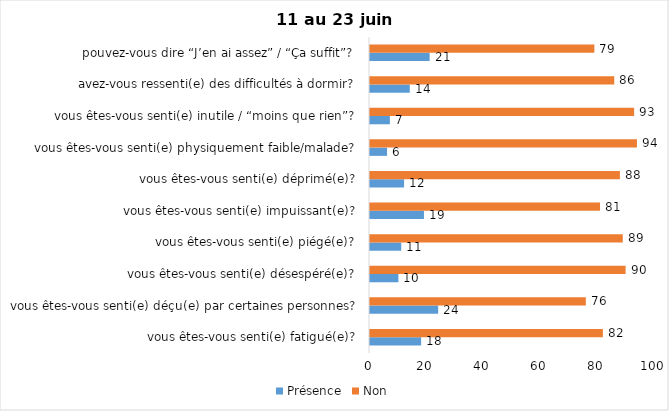
| Category | Présence | Non |
|---|---|---|
| vous êtes-vous senti(e) fatigué(e)? | 18 | 82 |
| vous êtes-vous senti(e) déçu(e) par certaines personnes? | 24 | 76 |
| vous êtes-vous senti(e) désespéré(e)? | 10 | 90 |
| vous êtes-vous senti(e) piégé(e)? | 11 | 89 |
| vous êtes-vous senti(e) impuissant(e)? | 19 | 81 |
| vous êtes-vous senti(e) déprimé(e)? | 12 | 88 |
| vous êtes-vous senti(e) physiquement faible/malade? | 6 | 94 |
| vous êtes-vous senti(e) inutile / “moins que rien”? | 7 | 93 |
| avez-vous ressenti(e) des difficultés à dormir? | 14 | 86 |
| pouvez-vous dire “J’en ai assez” / “Ça suffit”? | 21 | 79 |